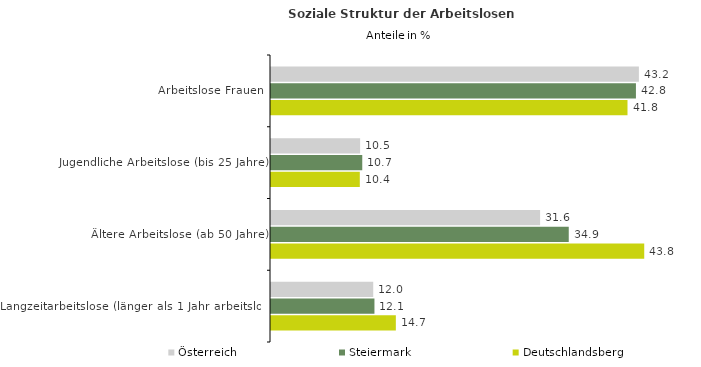
| Category | Österreich | Steiermark | Deutschlandsberg |
|---|---|---|---|
| Arbeitslose Frauen | 43.18 | 42.833 | 41.843 |
| Jugendliche Arbeitslose (bis 25 Jahre) | 10.46 | 10.711 | 10.423 |
| Ältere Arbeitslose (ab 50 Jahre) | 31.584 | 34.947 | 43.807 |
| Langzeitarbeitslose (länger als 1 Jahr arbeitslos) | 11.999 | 12.142 | 14.653 |